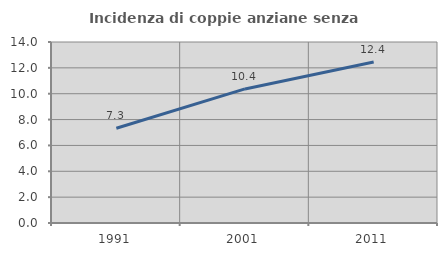
| Category | Incidenza di coppie anziane senza figli  |
|---|---|
| 1991.0 | 7.325 |
| 2001.0 | 10.371 |
| 2011.0 | 12.447 |